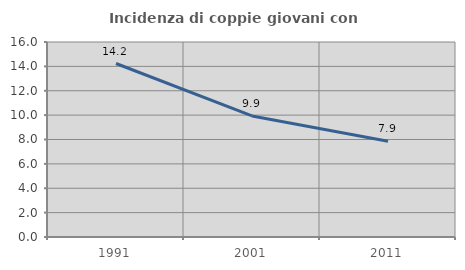
| Category | Incidenza di coppie giovani con figli |
|---|---|
| 1991.0 | 14.234 |
| 2001.0 | 9.933 |
| 2011.0 | 7.858 |